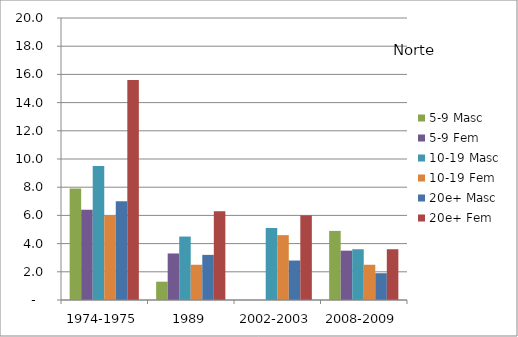
| Category | 5-9 Masc | 5-9 Fem | 10-19 Masc | 10-19 Fem | 20e+ Masc | 20e+ Fem |
|---|---|---|---|---|---|---|
| 1974-1975 | 7.9 | 6.4 | 9.5 | 6 | 7 | 15.6 |
| 1989 | 1.3 | 3.3 | 4.5 | 2.5 | 3.2 | 6.3 |
| 2002-2003 | 0 | 0 | 5.1 | 4.6 | 2.8 | 6 |
| 2008-2009 | 4.9 | 3.5 | 3.6 | 2.5 | 1.9 | 3.6 |